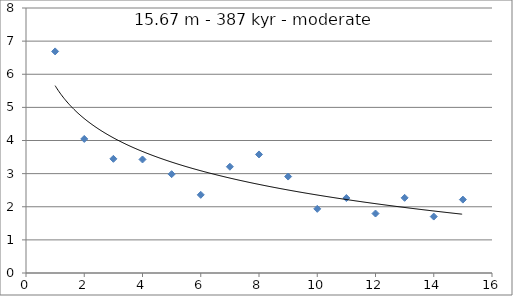
| Category | Series 1 |
|---|---|
| 1.0 | 6.69 |
| 2.0 | 4.047 |
| 3.0 | 3.446 |
| 4.0 | 3.427 |
| 5.0 | 2.984 |
| 6.0 | 2.36 |
| 7.0 | 3.208 |
| 8.0 | 3.579 |
| 9.0 | 2.911 |
| 10.0 | 1.937 |
| 11.0 | 2.263 |
| 12.0 | 1.795 |
| 13.0 | 2.269 |
| 14.0 | 1.704 |
| 15.0 | 2.216 |